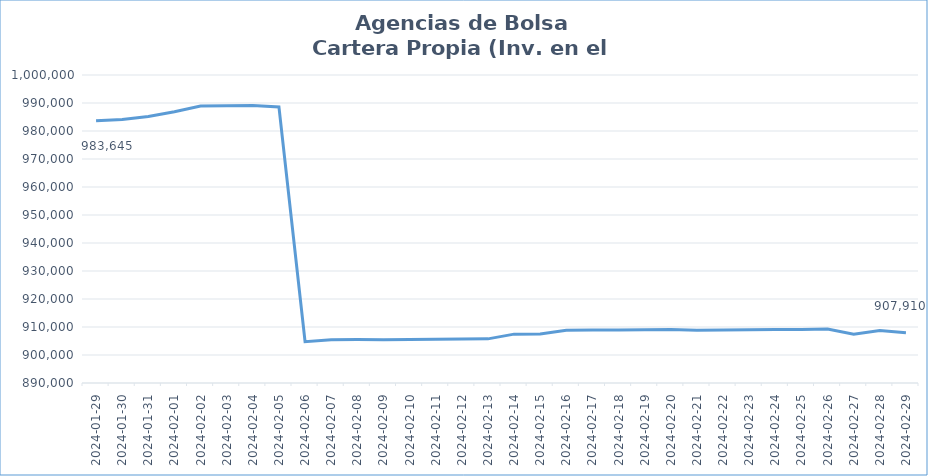
| Category | INV. EXTRANJERO |
|---|---|
| 2024-01-29 | 983644.85 |
| 2024-01-30 | 984139.65 |
| 2024-01-31 | 985184 |
| 2024-02-01 | 986869.4 |
| 2024-02-02 | 988930.8 |
| 2024-02-03 | 989021.5 |
| 2024-02-04 | 989115.6 |
| 2024-02-05 | 988602.8 |
| 2024-02-06 | 904776.5 |
| 2024-02-07 | 905483.6 |
| 2024-02-08 | 905533.3 |
| 2024-02-09 | 905473.65 |
| 2024-02-10 | 905546.35 |
| 2024-02-11 | 905619.05 |
| 2024-02-12 | 905691.65 |
| 2024-02-13 | 905762.35 |
| 2024-02-14 | 907452.2 |
| 2024-02-15 | 907542.4 |
| 2024-02-16 | 908814.3 |
| 2024-02-17 | 908886.9 |
| 2024-02-18 | 908959.6 |
| 2024-02-19 | 909028 |
| 2024-02-20 | 909100.7 |
| 2024-02-21 | 908811.05 |
| 2024-02-22 | 908889.5 |
| 2024-02-23 | 908988.2 |
| 2024-02-24 | 909062.8 |
| 2024-02-25 | 909131.5 |
| 2024-02-26 | 909303.85 |
| 2024-02-27 | 907451.3 |
| 2024-02-28 | 908775.9 |
| 2024-02-29 | 907909.75 |